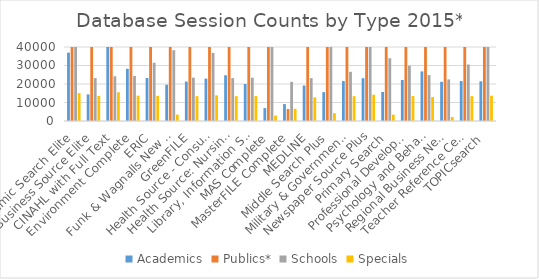
| Category | Academics | Publics* | Schools | Specials |
|---|---|---|---|---|
| Academic Search Elite | 36968 | 398077 | 42030 | 15048 |
| Business Source Elite | 14383 | 396824 | 23180 | 13554 |
| CINAHL with Full Text | 41089 | 397006 | 24188 | 15519 |
| Environment Complete | 28214 | 396746 | 24301 | 13682 |
| ERIC | 23213 | 396936 | 31503 | 13605 |
| Funk & Wagnalls New World Encyclopedia | 19610 | 358297 | 38270 | 3432 |
| GreenFILE | 21303 | 396647 | 23423 | 13434 |
| Health Source - Consumer Edition | 22917 | 397112 | 36804 | 13855 |
| Health Source: Nursing/Academic Edition | 24720 | 396553 | 23161 | 13446 |
| Library, Information Science & Technology Abstracts | 20028 | 396725 | 23407 | 13447 |
| MAS Complete | 6967 | 120864 | 44137 | 2924 |
| MasterFILE Complete | 9145 | 6460 | 21181 | 6606 |
| MEDLINE | 19181 | 396627 | 23139 | 12826 |
| Middle Search Plus | 15618 | 358671 | 49066 | 4220 |
| Military & Government Collection | 21579 | 396755 | 26577 | 13427 |
| Newspaper Source Plus | 23148 | 397776 | 46702 | 14194 |
| Primary Search | 15686 | 358257 | 33920 | 3418 |
| Professional Development Collection | 22189 | 396620 | 29880 | 13488 |
| Psychology and Behavioral Sciences Collection | 26809 | 396602 | 24824 | 12937 |
| Regional Business News | 21195 | 357626 | 22467 | 2136 |
| Teacher Reference Center | 21602 | 396799 | 30541 | 13439 |
| TOPICsearch | 21457 | 397287 | 41570 | 13668 |